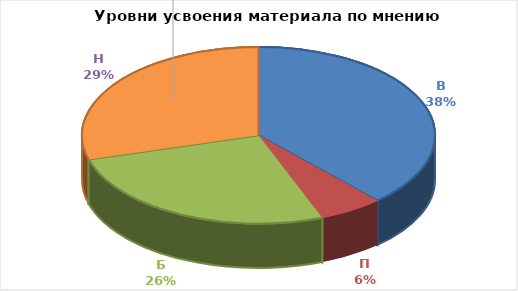
| Category | Series 0 |
|---|---|
| В | 13 |
| П | 2 |
| Б | 9 |
| Н | 10 |